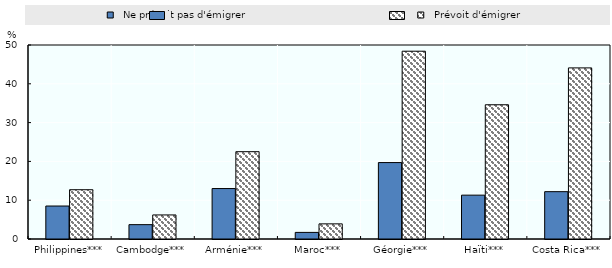
| Category |   Ne prévoit pas d'émigrer |   Prévoit d'émigrer |
|---|---|---|
| Philippines*** | 8.5 | 12.7 |
| Cambodge*** | 3.7 | 6.2 |
| Arménie*** | 13 | 22.5 |
| Maroc*** | 1.7 | 3.9 |
| Géorgie*** | 19.7 | 48.4 |
| Haïti*** | 11.3 | 34.6 |
| Costa Rica*** | 12.2 | 44.1 |